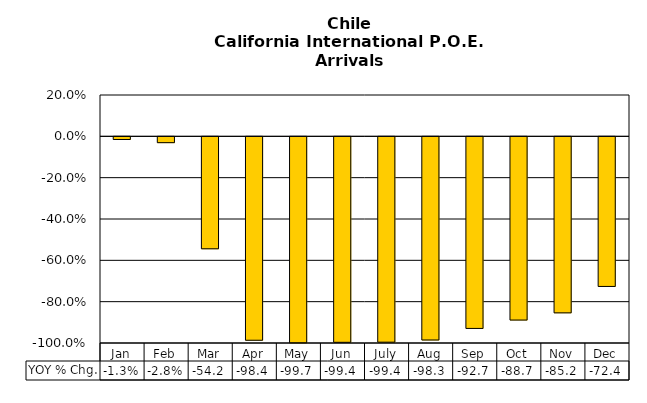
| Category | YOY % Chg. |
|---|---|
| Jan | -0.013 |
| Feb | -0.028 |
| Mar | -0.542 |
| Apr | -0.984 |
| May | -0.997 |
| Jun | -0.994 |
| July | -0.994 |
| Aug | -0.983 |
| Sep | -0.927 |
| Oct | -0.887 |
| Nov | -0.852 |
| Dec | -0.724 |